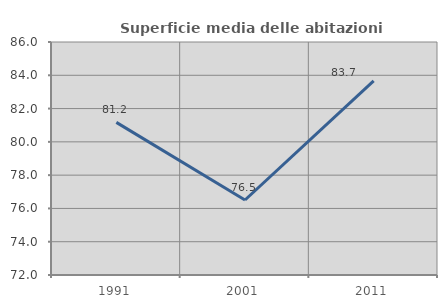
| Category | Superficie media delle abitazioni occupate |
|---|---|
| 1991.0 | 81.172 |
| 2001.0 | 76.507 |
| 2011.0 | 83.663 |